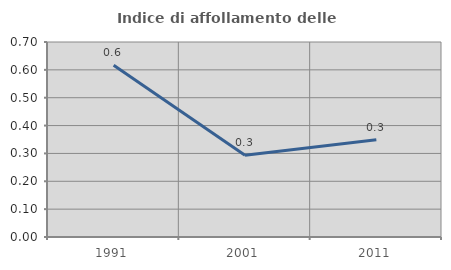
| Category | Indice di affollamento delle abitazioni  |
|---|---|
| 1991.0 | 0.617 |
| 2001.0 | 0.293 |
| 2011.0 | 0.349 |